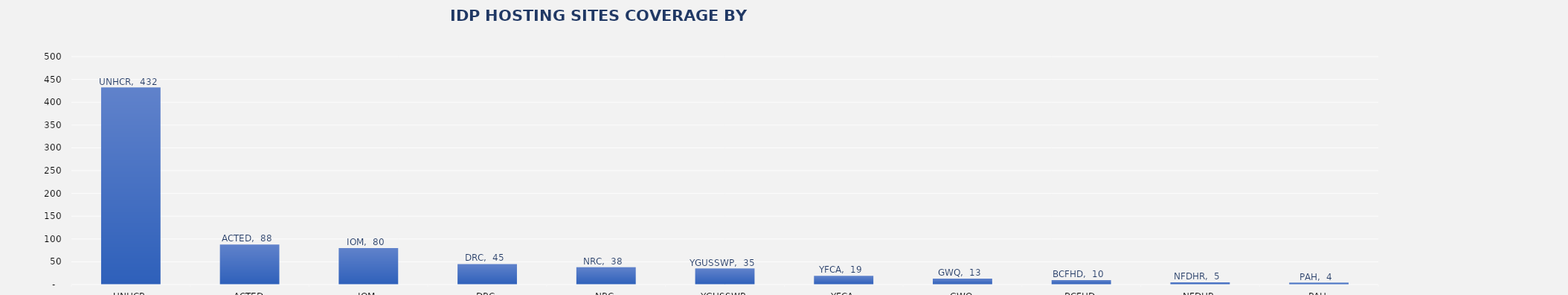
| Category | Total |
|---|---|
| UNHCR | 432 |
| ACTED | 88 |
| IOM | 80 |
| DRC | 45 |
| NRC | 38 |
| YGUSSWP | 35 |
| YFCA | 19 |
| GWQ | 13 |
| BCFHD | 10 |
| NFDHR | 5 |
| PAH | 4 |